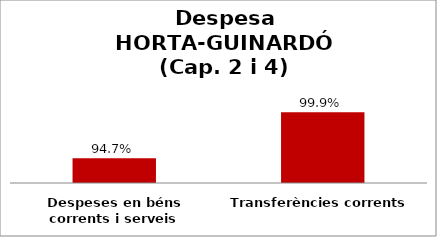
| Category | Series 0 |
|---|---|
| Despeses en béns corrents i serveis | 0.947 |
| Transferències corrents | 0.999 |